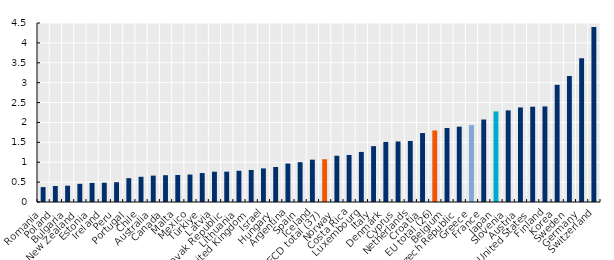
| Category | Series 0 |
|---|---|
| Romania | 0.375 |
| Poland | 0.402 |
| Bulgaria | 0.41 |
| New Zealand | 0.457 |
| Estonia | 0.48 |
| Ireland | 0.484 |
| Peru | 0.498 |
| Portugal | 0.599 |
| Chile | 0.634 |
| Australia | 0.663 |
| Canada | 0.674 |
| Malta | 0.678 |
| Mexico | 0.69 |
| Türkiye | 0.728 |
| Latvia | 0.762 |
| Slovak Republic | 0.763 |
| Lithuania | 0.785 |
| United Kingdom | 0.805 |
| Israel | 0.845 |
| Hungary | 0.881 |
| Argentina | 0.966 |
| Spain | 1.001 |
| Iceland | 1.064 |
| OECD total (37) | 1.075 |
| Norway | 1.163 |
| Costa Rica | 1.182 |
| Luxembourg | 1.26 |
| Italy | 1.404 |
| Denmark | 1.51 |
| Cyprus | 1.522 |
| Netherlands | 1.533 |
| Croatia | 1.733 |
| EU total (26) | 1.798 |
| Belgium | 1.86 |
| Czech Republic | 1.894 |
| Greece | 1.933 |
| France | 2.074 |
| Japan | 2.276 |
| Slovenia | 2.303 |
| Austria | 2.377 |
| United States | 2.396 |
| Finland | 2.403 |
| Korea | 2.945 |
| Sweden | 3.169 |
| Germany | 3.614 |
| Switzerland | 4.398 |